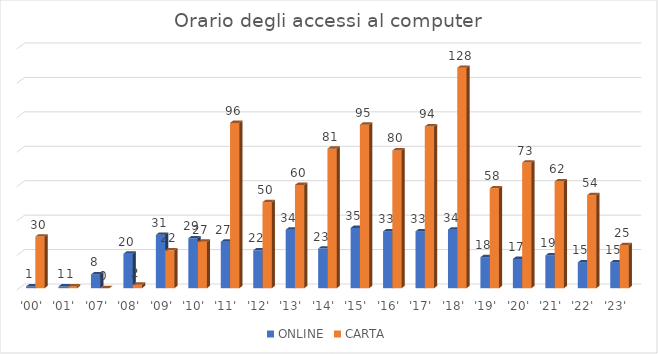
| Category | ONLINE | CARTA |
|---|---|---|
| '00' | 1 | 30 |
| '01' | 1 | 1 |
| '07' | 8 | 0 |
| '08' | 20 | 2 |
| '09' | 31 | 22 |
| '10' | 29 | 27 |
| '11' | 27 | 96 |
| '12' | 22 | 50 |
| '13' | 34 | 60 |
| '14' | 23 | 81 |
| '15' | 35 | 95 |
| '16' | 33 | 80 |
| '17' | 33 | 94 |
| '18' | 34 | 128 |
| '19' | 18 | 58 |
| '20' | 17 | 73 |
| '21' | 19 | 62 |
| '22' | 15 | 54 |
| '23' | 15 | 25 |